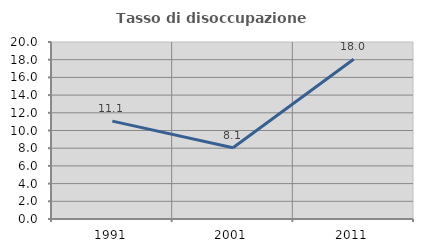
| Category | Tasso di disoccupazione giovanile  |
|---|---|
| 1991.0 | 11.061 |
| 2001.0 | 8.056 |
| 2011.0 | 18.049 |